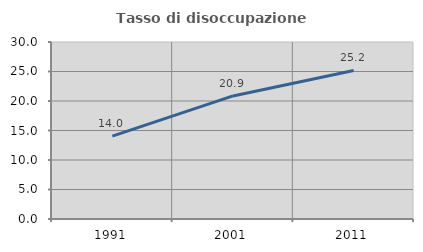
| Category | Tasso di disoccupazione giovanile  |
|---|---|
| 1991.0 | 14.035 |
| 2001.0 | 20.859 |
| 2011.0 | 25.18 |